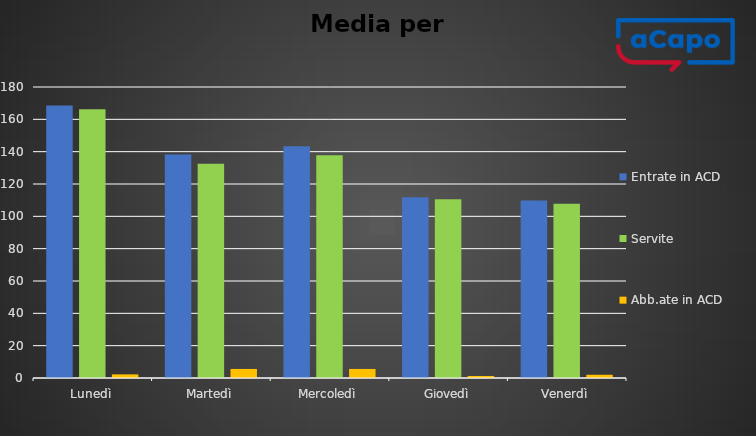
| Category | Entrate in ACD | Servite | Abb.ate in ACD |
|---|---|---|---|
| Lunedì | 168.5 | 166.25 | 2.25 |
| Martedì | 138.2 | 132.6 | 5.6 |
| Mercoledì | 143.4 | 137.8 | 5.6 |
| Giovedì | 111.75 | 110.5 | 1.25 |
| Venerdì | 109.75 | 107.75 | 2 |